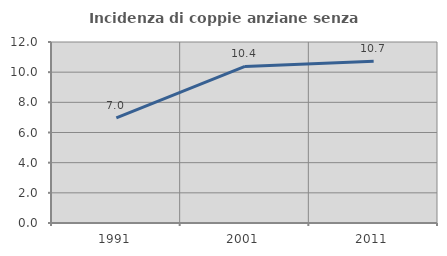
| Category | Incidenza di coppie anziane senza figli  |
|---|---|
| 1991.0 | 6.964 |
| 2001.0 | 10.377 |
| 2011.0 | 10.717 |